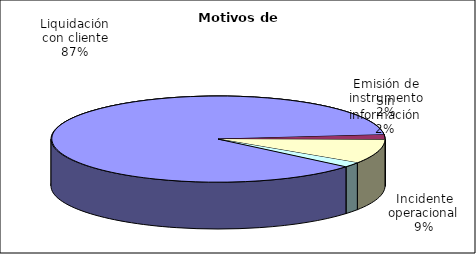
| Category | Motivos |
|---|---|
| Liquidación con cliente | 432 |
| Emisión de instrumento | 9 |
| Incidente operacional | 45 |
| Sin información | 9 |